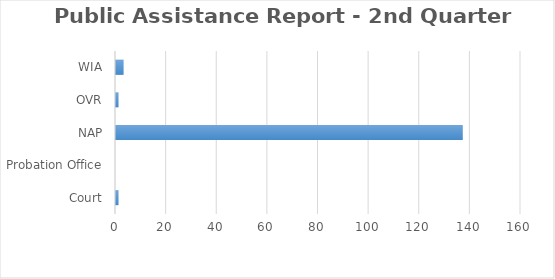
| Category | Series 0 |
|---|---|
| Court | 1 |
| Probation Office | 0 |
| NAP | 137 |
| OVR | 1 |
| WIA | 3 |